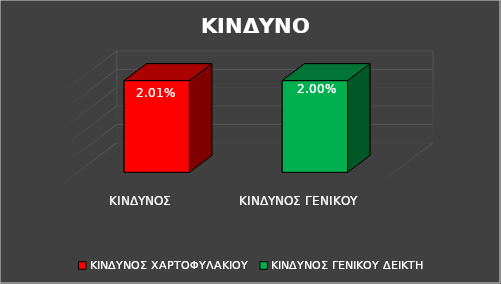
| Category | Series 0 |
|---|---|
| ΚΙΝΔΥΝΟΣ ΧΑΡΤΟΦΥΛΑΚΙΟΥ | 0.02 |
| ΚΙΝΔΥΝΟΣ ΓΕΝΙΚΟΥ ΔΕΙΚΤΗ | 0.02 |